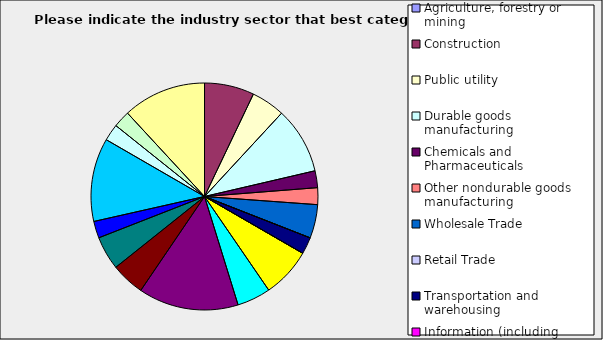
| Category | Series 0 |
|---|---|
| Agriculture, forestry or mining | 0 |
| Construction | 0.071 |
| Public utility | 0.048 |
| Durable goods manufacturing | 0.095 |
| Chemicals and Pharmaceuticals | 0.024 |
| Other nondurable goods manufacturing | 0.024 |
| Wholesale Trade | 0.048 |
| Retail Trade | 0 |
| Transportation and warehousing | 0.024 |
| Information (including broadcasting and telecommunication) | 0 |
| Finance and Insurance | 0.071 |
| Real Estate | 0.048 |
| Professional, scientific and technical services | 0.143 |
| Consulting | 0.048 |
| Administrative and office services (including waste management) | 0.048 |
| Education | 0.024 |
| Health Care and social services | 0.119 |
| Arts, entertainment and recreation | 0.024 |
| Accommodation and food services | 0.024 |
| Other | 0.119 |